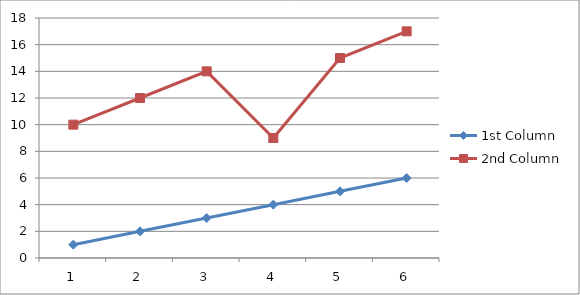
| Category | 1st Column | 2nd Column |
|---|---|---|
| 0 | 1 | 10 |
| 1 | 2 | 12 |
| 2 | 3 | 14 |
| 3 | 4 | 9 |
| 4 | 5 | 15 |
| 5 | 6 | 17 |